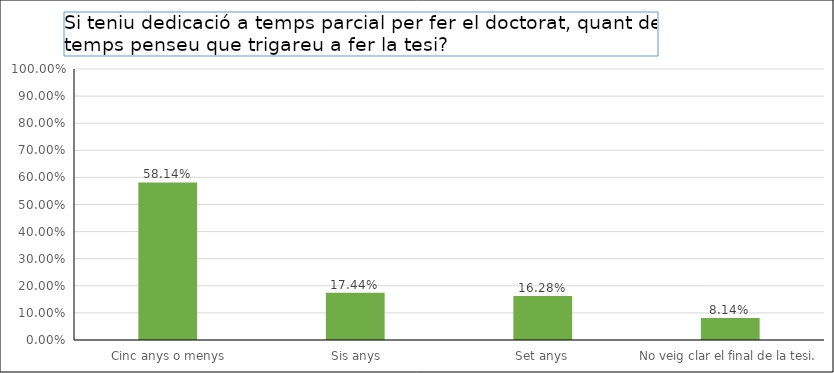
| Category | Series 0 |
|---|---|
|  Cinc anys o menys | 0.581 |
|  Sis anys | 0.174 |
| Set anys | 0.163 |
| No veig clar el final de la tesi. | 0.081 |